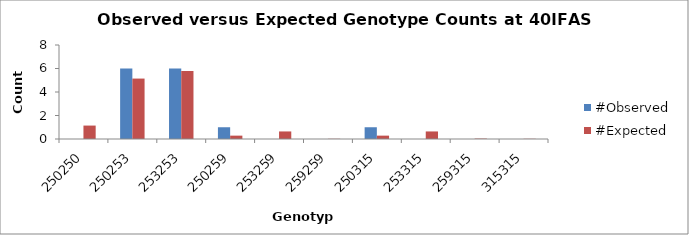
| Category | #Observed | #Expected |
|---|---|---|
| 250250.0 | 0 | 1.143 |
| 250253.0 | 6 | 5.143 |
| 253253.0 | 6 | 5.786 |
| 250259.0 | 1 | 0.286 |
| 253259.0 | 0 | 0.643 |
| 259259.0 | 0 | 0.018 |
| 250315.0 | 1 | 0.286 |
| 253315.0 | 0 | 0.643 |
| 259315.0 | 0 | 0.036 |
| 315315.0 | 0 | 0.018 |